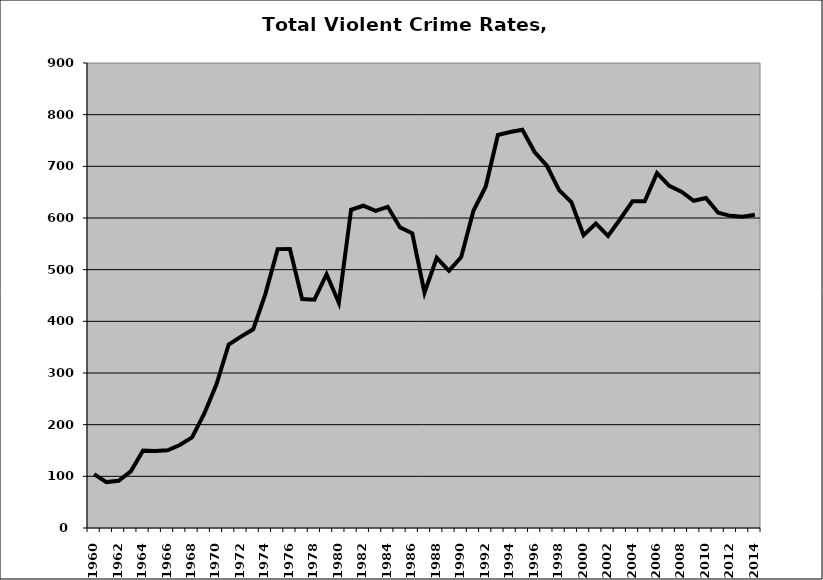
| Category | VCR |
|---|---|
| 1960.0 | 104.348 |
| 1961.0 | 88.889 |
| 1962.0 | 91.463 |
| 1963.0 | 109.677 |
| 1964.0 | 150 |
| 1965.0 | 149.012 |
| 1966.0 | 150.368 |
| 1967.0 | 160.662 |
| 1968.0 | 175.451 |
| 1969.0 | 221.277 |
| 1970.0 | 277.986 |
| 1971.0 | 355.272 |
| 1972.0 | 370.462 |
| 1973.0 | 384.545 |
| 1974.0 | 453.116 |
| 1975.0 | 539.773 |
| 1976.0 | 540.052 |
| 1977.0 | 443.243 |
| 1978.0 | 441.935 |
| 1979.0 | 491.133 |
| 1980.0 | 435.996 |
| 1981.0 | 615.777 |
| 1982.0 | 623.744 |
| 1983.0 | 613.779 |
| 1984.0 | 621.6 |
| 1985.0 | 581.766 |
| 1986.0 | 570.412 |
| 1987.0 | 455.429 |
| 1988.0 | 522.807 |
| 1989.0 | 497.723 |
| 1990.0 | 524.504 |
| 1991.0 | 613.86 |
| 1992.0 | 660.477 |
| 1993.0 | 760.768 |
| 1994.0 | 766.337 |
| 1995.0 | 770.861 |
| 1996.0 | 727.677 |
| 1997.0 | 701.149 |
| 1998.0 | 653.909 |
| 1999.0 | 630.831 |
| 2000.0 | 566.888 |
| 2001.0 | 589.461 |
| 2002.0 | 565.409 |
| 2003.0 | 598.044 |
| 2004.0 | 632.302 |
| 2005.0 | 632.338 |
| 2006.0 | 686.811 |
| 2007.0 | 662.348 |
| 2008.0 | 650.899 |
| 2009.0 | 633.382 |
| 2010.0 | 638.806 |
| 2011.0 | 610.063 |
| 2012.0 | 604.129 |
| 2013.0 | 602.366 |
| 2014.0 | 606.462 |